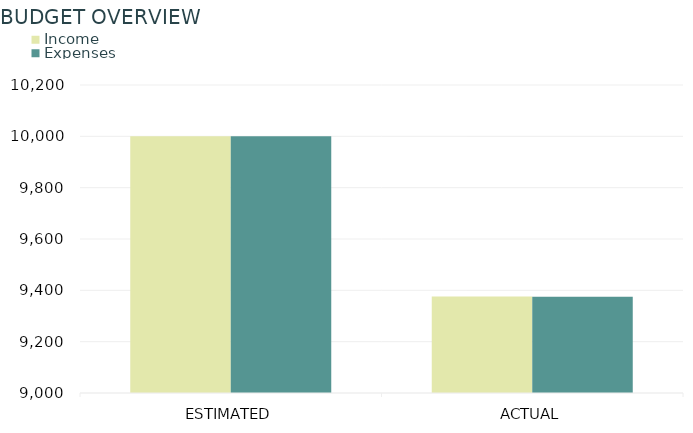
| Category | Income | Expenses |
|---|---|---|
| ESTIMATED | 10000 | 10000 |
| ACTUAL | 9375.62 | 9375.21 |